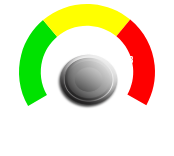
| Category | PIE |
|---|---|
| 0 | 8 |
| 1 | 0.24 |
| 2 | 9.76 |